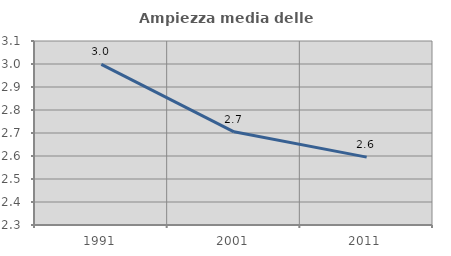
| Category | Ampiezza media delle famiglie |
|---|---|
| 1991.0 | 2.998 |
| 2001.0 | 2.705 |
| 2011.0 | 2.595 |